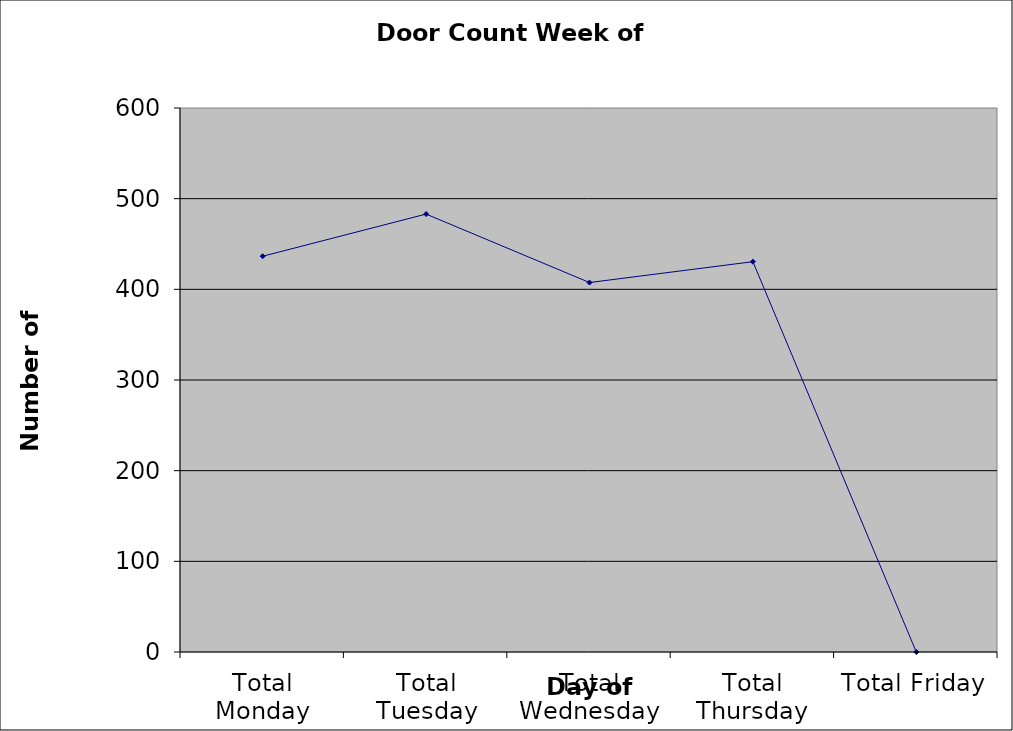
| Category | Series 0 |
|---|---|
| Total Monday | 436.5 |
| Total Tuesday | 483 |
| Total Wednesday | 407.5 |
| Total Thursday | 430.5 |
| Total Friday | 0 |